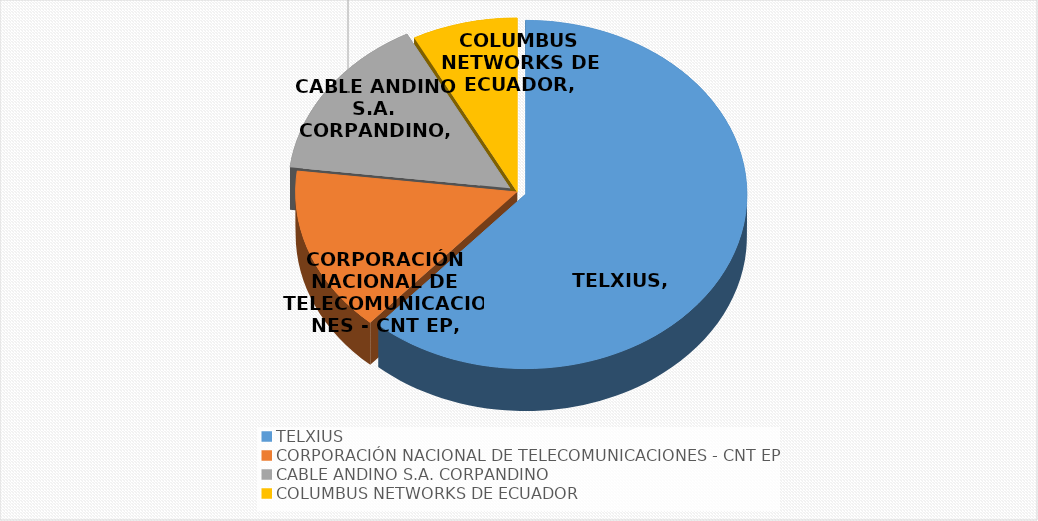
| Category | Series 0 |
|---|---|
| TELXIUS | 0.615 |
| CORPORACIÓN NACIONAL DE TELECOMUNICACIONES - CNT EP | 0.154 |
| CABLE ANDINO S.A. CORPANDINO | 0.154 |
| COLUMBUS NETWORKS DE ECUADOR | 0.077 |